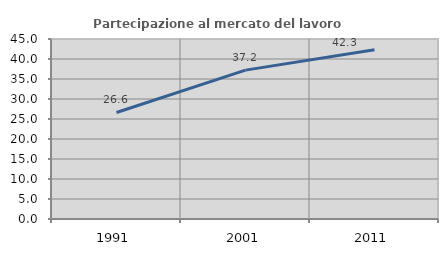
| Category | Partecipazione al mercato del lavoro  femminile |
|---|---|
| 1991.0 | 26.629 |
| 2001.0 | 37.218 |
| 2011.0 | 42.287 |